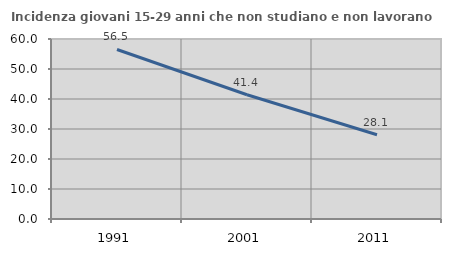
| Category | Incidenza giovani 15-29 anni che non studiano e non lavorano  |
|---|---|
| 1991.0 | 56.504 |
| 2001.0 | 41.423 |
| 2011.0 | 28.09 |